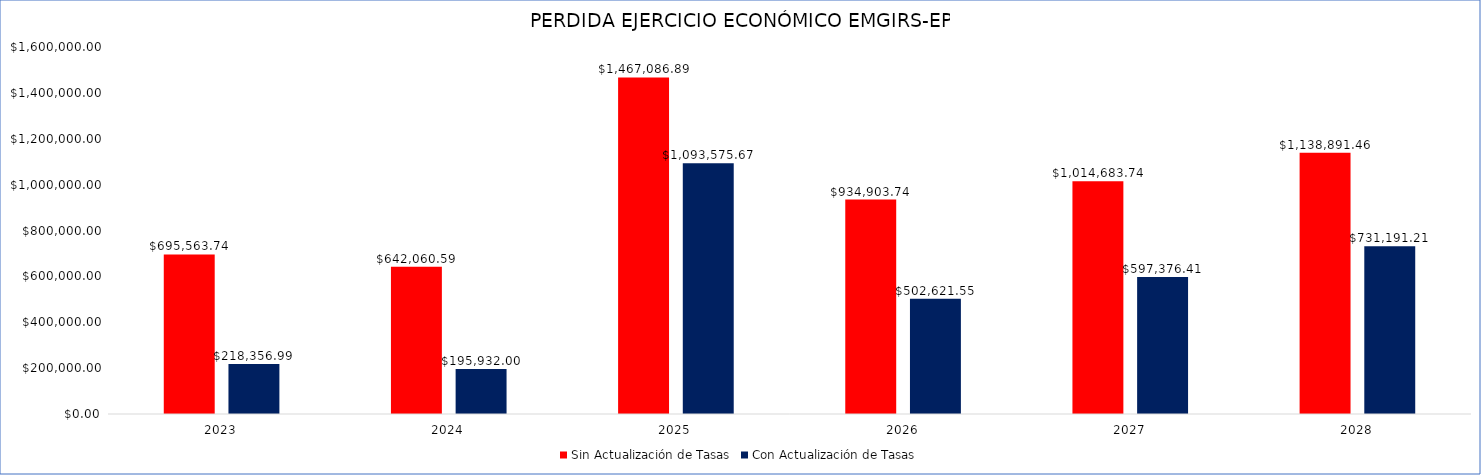
| Category | Sin Actualización de Tasas | Con Actualización de Tasas |
|---|---|---|
| 2023 | 695563.74 | 218356.989 |
| 2024 | 642060.59 | 195931.999 |
| 2025 | 1467086.89 | 1093575.667 |
| 2026 | 934903.74 | 502621.552 |
| 2027 | 1014683.74 | 597376.406 |
| 2028 | 1138891.457 | 731191.208 |